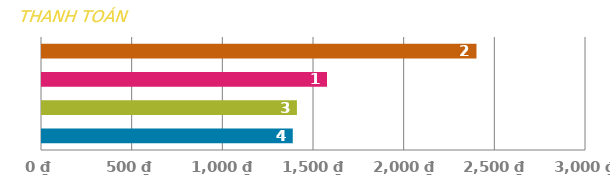
| Category | KHOẢN THANH TOÁN |
|---|---|
| 0 | 1382.921 |
| 1 | 1405.775 |
| 2 | 1571.655 |
| 3 | 2396.046 |